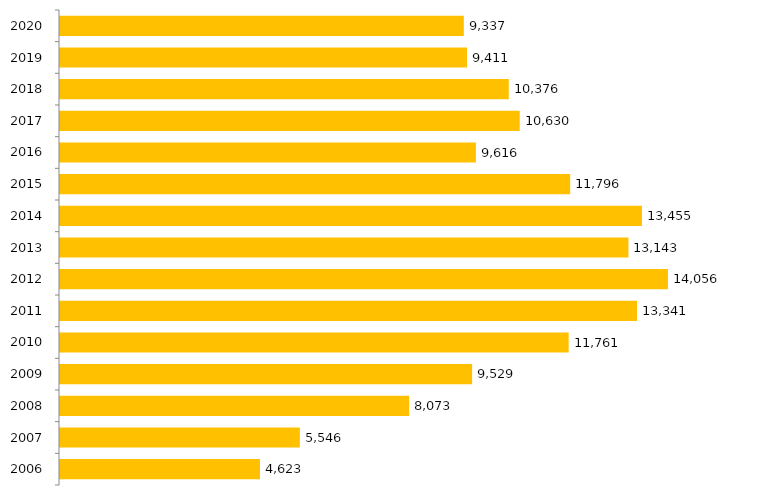
| Category | Inscritos |
|---|---|
| 2006.0 | 4623 |
| 2007.0 | 5546 |
| 2008.0 | 8073 |
| 2009.0 | 9529 |
| 2010.0 | 11761 |
| 2011.0 | 13341 |
| 2012.0 | 14056 |
| 2013.0 | 13143 |
| 2014.0 | 13455 |
| 2015.0 | 11796 |
| 2016.0 | 9616 |
| 2017.0 | 10630 |
| 2018.0 | 10376 |
| 2019.0 | 9411 |
| 2020.0 | 9337 |